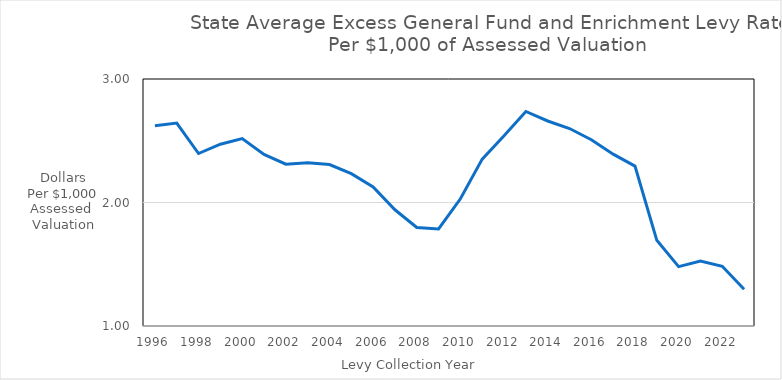
| Category | Series 0 |
|---|---|
| 1996 | 2.622 |
| 1997 | 2.643 |
| 1998 | 2.397 |
| 1999 | 2.472 |
| 2000 | 2.518 |
| 2001 | 2.389 |
| 2002 | 2.31 |
| 2003 | 2.322 |
| 2004 | 2.308 |
| 2005 | 2.233 |
| 2006 | 2.126 |
| 2007 | 1.941 |
| 2008 | 1.797 |
| 2009 | 1.786 |
| 2010 | 2.03 |
| 2011 | 2.351 |
| 2012 | 2.54 |
| 2013 | 2.737 |
| 2014 | 2.66 |
| 2015 | 2.599 |
| 2016 | 2.508 |
| 2017 | 2.391 |
| 2018 | 2.295 |
| 2019 | 1.694 |
| 2020 | 1.481 |
| 2021 | 1.527 |
| 2022 | 1.484 |
| 2023 | 1.298 |